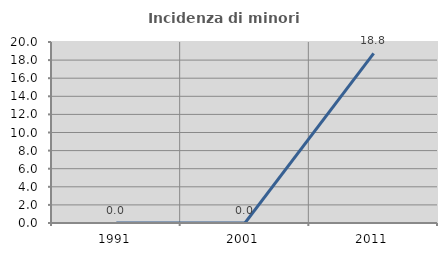
| Category | Incidenza di minori stranieri |
|---|---|
| 1991.0 | 0 |
| 2001.0 | 0 |
| 2011.0 | 18.75 |